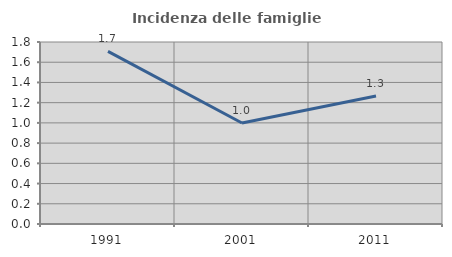
| Category | Incidenza delle famiglie numerose |
|---|---|
| 1991.0 | 1.708 |
| 2001.0 | 0.999 |
| 2011.0 | 1.267 |